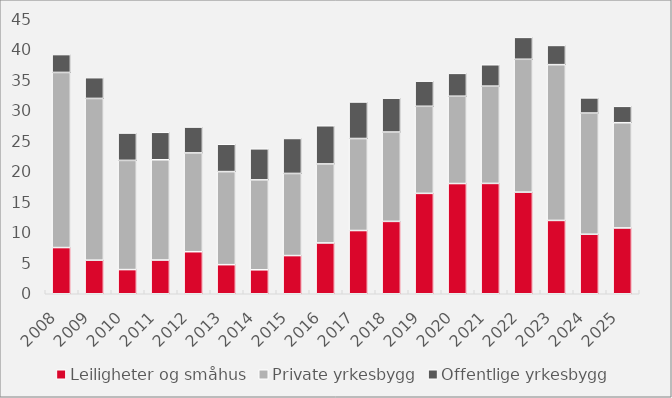
| Category | Leiligheter og småhus | Private yrkesbygg | Offentlige yrkesbygg |
|---|---|---|---|
| 2008.0 | 7.56 | 28.655 | 2.922 |
| 2009.0 | 5.49 | 26.472 | 3.395 |
| 2010.0 | 3.955 | 17.868 | 4.474 |
| 2011.0 | 5.52 | 16.406 | 4.492 |
| 2012.0 | 6.88 | 16.162 | 4.236 |
| 2013.0 | 4.759 | 15.228 | 4.473 |
| 2014.0 | 3.922 | 14.713 | 5.082 |
| 2015.0 | 6.248 | 13.439 | 5.722 |
| 2016.0 | 8.315 | 12.927 | 6.248 |
| 2017.0 | 10.347 | 15.057 | 5.975 |
| 2018.0 | 11.841 | 14.622 | 5.545 |
| 2019.0 | 16.426 | 14.25 | 4.112 |
| 2020.0 | 18.035 | 14.288 | 3.739 |
| 2021.0 | 18.055 | 15.919 | 3.5 |
| 2022.0 | 16.625 | 21.744 | 3.581 |
| 2023.0 | 11.997 | 25.493 | 3.144 |
| 2024.0 | 9.735 | 19.832 | 2.481 |
| 2025.0 | 10.771 | 17.216 | 2.681 |